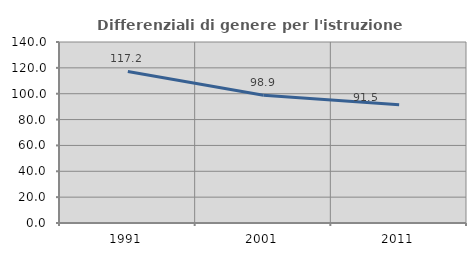
| Category | Differenziali di genere per l'istruzione superiore |
|---|---|
| 1991.0 | 117.235 |
| 2001.0 | 98.887 |
| 2011.0 | 91.503 |